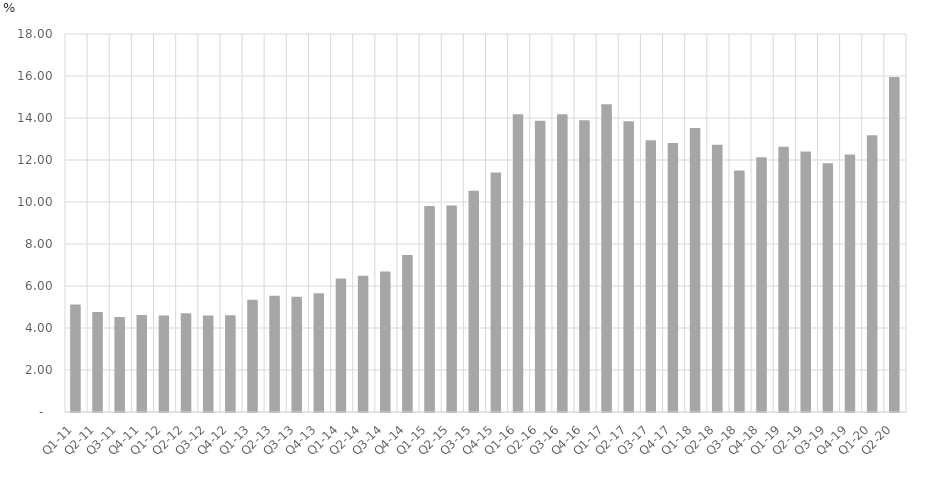
| Category | Percent of Total GDP |
|---|---|
| Q1-11 | 5.046 |
| Q2-11 | 4.688 |
| Q3-11 | 4.448 |
| Q4-11 | 4.546 |
| Q1-12 | 4.519 |
| Q2-12 | 4.63 |
| Q3-12 | 4.524 |
| Q4-12 | 4.531 |
| Q1-13 | 5.273 |
| Q2-13 | 5.46 |
| Q3-13 | 5.416 |
| Q4-13 | 5.586 |
| Q1-14 | 6.291 |
| Q2-14 | 6.417 |
| Q3-14 | 6.619 |
| Q4-14 | 7.402 |
| Q1-15 | 9.743 |
| Q2-15 | 9.763 |
| Q3-15 | 10.463 |
| Q4-15 | 11.334 |
| Q1-16 | 14.103 |
| Q2-16 | 13.793 |
| Q3-16 | 14.108 |
| Q4-16 | 13.826 |
| Q1-17 | 14.585 |
| Q2-17 | 13.768 |
| Q3-17 | 12.871 |
| Q4-17 | 12.74 |
| Q1-18 | 13.457 |
| Q2-18 | 12.65 |
| Q3-18 | 11.428 |
| Q4-18 | 12.065 |
| Q1-19 | 12.558 |
| Q2-19 | 12.331 |
| Q3-19 | 11.772 |
| Q4-19 | 12.189 |
| Q1-20 | 13.107 |
| Q2-20 | 15.876 |